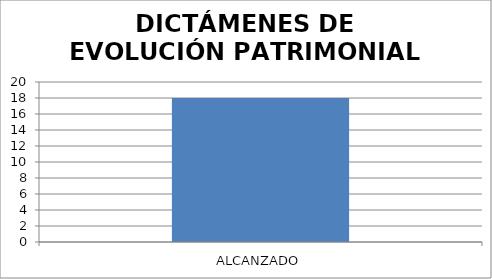
| Category | DICTAMENES DE EVOLUCIÓN PATRIMONIAL |
|---|---|
| ALCANZADO | 18 |